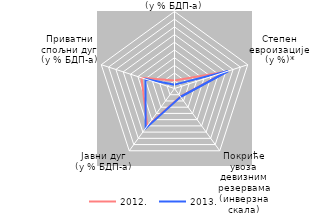
| Category | 2012. | 2013. |
|---|---|---|
| Дефицит платног биланса
(у % БДП-a) | 10.5 | 5 |
| Степен
евроизације
(у %)* | 71.986 | 73.208 |
| Покриће увоза девизним резервама
(инверзна скала) | 13.141 | 13.42 |
| Јавни дуг
(у % БДП-a) | 60.009 | 63.8 |
| Приватни
спољни дуг
(у % БДП-a) | 45.062 | 39.6 |